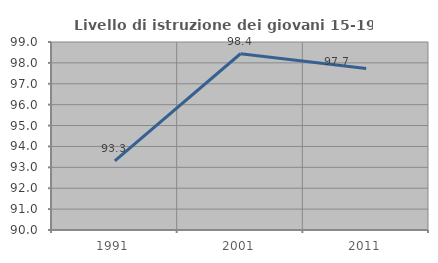
| Category | Livello di istruzione dei giovani 15-19 anni |
|---|---|
| 1991.0 | 93.311 |
| 2001.0 | 98.438 |
| 2011.0 | 97.727 |